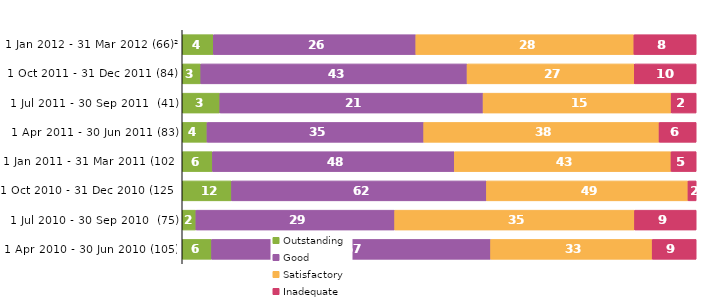
| Category | Outstanding | Good | Satisfactory | Inadequate |
|---|---|---|---|---|
| 1 Jan 2012 - 31 Mar 2012 (66)² | 4 | 26 | 28 | 8 |
| 1 Oct 2011 - 31 Dec 2011 (84) | 3 | 43 | 27 | 10 |
| 1 Jul 2011 - 30 Sep 2011  (41) | 3 | 21 | 15 | 2 |
| 1 Apr 2011 - 30 Jun 2011 (83) | 4 | 35 | 38 | 6 |
| 1 Jan 2011 - 31 Mar 2011 (102) | 6 | 48 | 43 | 5 |
| 1 Oct 2010 - 31 Dec 2010 (125) | 12 | 62 | 49 | 2 |
| 1 Jul 2010 - 30 Sep 2010  (75) | 2 | 29 | 35 | 9 |
| 1 Apr 2010 - 30 Jun 2010 (105) | 6 | 57 | 33 | 9 |